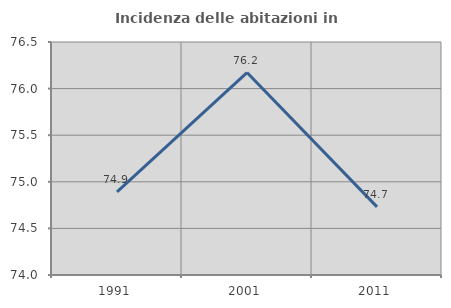
| Category | Incidenza delle abitazioni in proprietà  |
|---|---|
| 1991.0 | 74.891 |
| 2001.0 | 76.172 |
| 2011.0 | 74.731 |